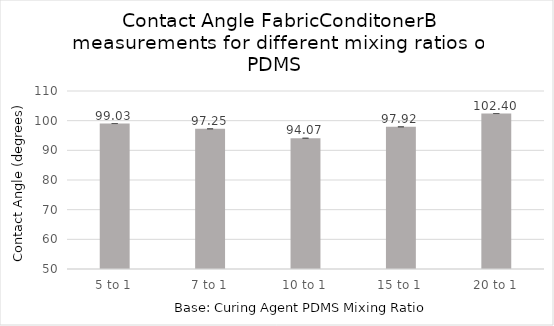
| Category | Series 0 |
|---|---|
| 5 to 1 | 99.033 |
| 7 to 1 | 97.247 |
| 10 to 1 | 94.073 |
| 15 to 1 | 97.92 |
| 20 to 1 | 102.403 |